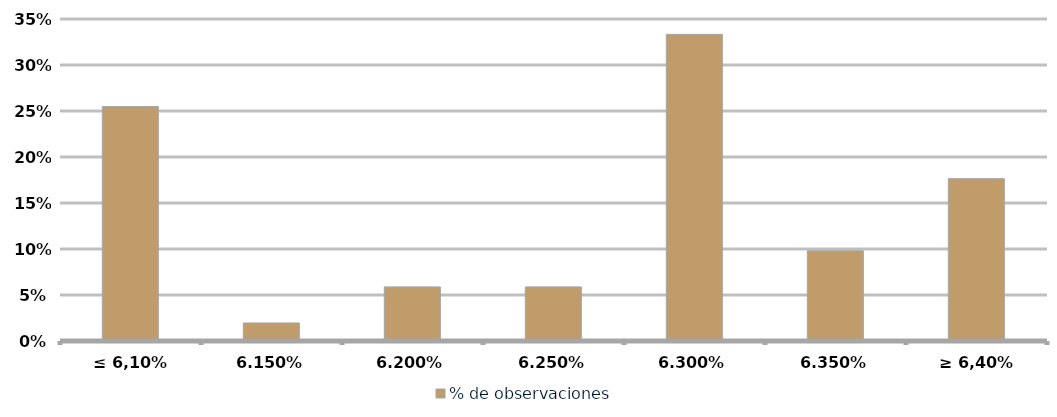
| Category | % de observaciones  |
|---|---|
| ≤ 6,10% | 0.255 |
| 6,15% | 0.02 |
| 6,20% | 0.059 |
| 6,25% | 0.059 |
| 6,30% | 0.333 |
| 6,35% | 0.098 |
| ≥ 6,40% | 0.176 |